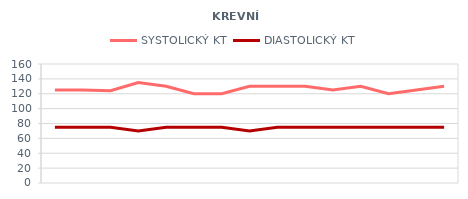
| Category | SYSTOLICKÝ KT | DIASTOLICKÝ KT |
|---|---|---|
| 6/1/12 | 125 | 75 |
| 6/2/12 | 125 | 75 |
| 6/3/12 | 124 | 75 |
| 6/4/12 | 135 | 70 |
| 6/5/12 | 130 | 75 |
| 6/6/12 | 120 | 75 |
| 6/7/12 | 120 | 75 |
| 6/8/12 | 130 | 70 |
| 6/9/12 | 130 | 75 |
| 6/10/12 | 130 | 75 |
| 6/11/12 | 125 | 75 |
| 6/12/12 | 130 | 75 |
| 6/13/12 | 120 | 75 |
| 6/14/12 | 125 | 75 |
| 6/15/12 | 130 | 75 |